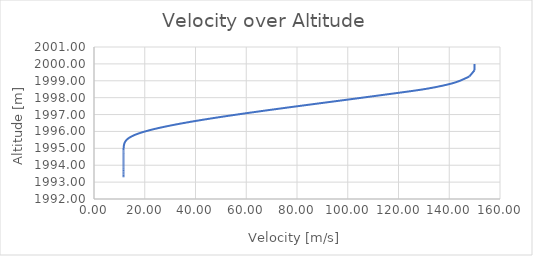
| Category | Series 0 |
|---|---|
| 150.0 | 2000 |
| 149.97086075854148 | 1999.625 |
| 147.90089738176488 | 1999.25 |
| 141.94794976973546 | 1998.88 |
| 131.03935326905386 | 1998.525 |
| 115.59624428672038 | 1998.198 |
| 101.2071370195375 | 1997.909 |
| 88.37861573599666 | 1997.656 |
| 77.24487331231943 | 1997.435 |
| 67.7283294823433 | 1997.242 |
| 59.65581667647372 | 1997.072 |
| 52.826982406445325 | 1996.923 |
| 47.04866464922071 | 1996.791 |
| 42.14919957265686 | 1996.674 |
| 37.98227121398129 | 1996.568 |
| 34.42590687221514 | 1996.473 |
| 31.379575237931334 | 1996.387 |
| 28.760825498428602 | 1996.309 |
| 26.50210211288084 | 1996.237 |
| 24.547969915381064 | 1996.171 |
| 22.852797287076996 | 1996.109 |
| 21.378865653540377 | 1996.052 |
| 20.09484588683537 | 1995.999 |
| 18.974578091055808 | 1995.948 |
| 17.996096847785815 | 1995.901 |
| 17.140852729472105 | 1995.856 |
| 16.393089828188906 | 1995.813 |
| 15.739347032040301 | 1995.772 |
| 15.168057471420202 | 1995.733 |
| 14.66922597207998 | 1995.695 |
| 14.234168648352334 | 1995.658 |
| 13.855302139834144 | 1995.623 |
| 13.525972621404373 | 1995.588 |
| 13.240316757975473 | 1995.554 |
| 12.993148362197172 | 1995.521 |
| 12.779865749818157 | 1995.489 |
| 12.596375755709525 | 1995.457 |
| 12.439031137546493 | 1995.425 |
| 12.304578703004978 | 1995.394 |
| 12.190115987498451 | 1995.363 |
| 12.093054711092249 | 1995.333 |
| 12.011089576077973 | 1995.303 |
| 11.942171245821113 | 1995.273 |
| 11.884482581551666 | 1995.243 |
| 11.836417414097967 | 1995.213 |
| 11.796561297162478 | 1995.183 |
| 11.763673831029475 | 1995.154 |
| 11.736672263065616 | 1995.125 |
| 11.71461616606045 | 1995.095 |
| 11.69669306928024 | 1995.066 |
| 11.68220497209901 | 1995.037 |
| 11.670555708440766 | 1995.007 |
| 11.661239154423129 | 1994.978 |
| 11.65382828406695 | 1994.949 |
| 11.647965081282138 | 1994.92 |
| 11.643351313014852 | 1994.891 |
| 11.639740160700097 | 1994.862 |
| 11.636928696971705 | 1994.833 |
| 11.63475118355911 | 1994.804 |
| 11.633073155699073 | 1994.774 |
| 11.631786249100479 | 1994.745 |
| 11.630803718079163 | 1994.716 |
| 11.630056588198977 | 1994.687 |
| 11.629490383656991 | 1994.658 |
| 11.629062368604075 | 1994.629 |
| 11.628739242350573 | 1994.6 |
| 11.628495230655595 | 1994.571 |
| 11.628310518696537 | 1994.542 |
| 11.628169975525502 | 1994.513 |
| 11.628062124530839 | 1994.484 |
| 11.62797831936479 | 1994.455 |
| 11.627912089749556 | 1994.426 |
| 11.6278586263606 | 1994.397 |
| 11.627814378481496 | 1994.367 |
| 11.6277767422451 | 1994.338 |
| 11.627743820973903 | 1994.309 |
| 11.627714242389507 | 1994.28 |
| 11.627687020282025 | 1994.251 |
| 11.627661450635502 | 1994.222 |
| 11.627637034227256 | 1994.193 |
| 11.627613419395736 | 1994.164 |
| 11.627590360044447 | 1994.135 |
| 11.627567685060203 | 1994.106 |
| 11.627545276212189 | 1994.077 |
| 11.627523052300761 | 1994.048 |
| 11.627500957874474 | 1994.019 |
| 11.627478955259258 | 1993.99 |
| 11.6274570189698 | 1993.96 |
| 11.62743513182054 | 1993.931 |
| 11.627413282239669 | 1993.902 |
| 11.62739146242781 | 1993.873 |
| 11.627369667105127 | 1993.844 |
| 11.627347892665114 | 1993.815 |
| 11.62732613660721 | 1993.786 |
| 11.627304397159111 | 1993.757 |
| 11.627282673027112 | 1993.728 |
| 11.627260963232198 | 1993.699 |
| 11.627239267003096 | 1993.67 |
| 11.627217583706921 | 1993.641 |
| 11.627195912804389 | 1993.612 |
| 11.627174253821018 | 1993.583 |
| 11.627152606328611 | 1993.554 |
| 11.627130969933347 | 1993.524 |
| 11.627109344268076 | 1993.495 |
| 11.627087728987256 | 1993.466 |
| 11.627066123763582 | 1993.437 |
| 11.62704452828566 | 1993.408 |
| 11.627022942256346 | 1993.379 |
| 11.627001365391513 | 1993.35 |
| 11.626979797419072 | 1993.321 |
| 11.62695823807819 | 1993.292 |